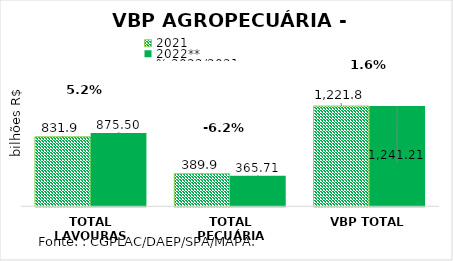
| Category | 2021 | 2022** |
|---|---|---|
| TOTAL LAVOURAS | 831.898 | 875.503 |
| TOTAL PECUÁRIA | 389.881 | 365.71 |
| VBP TOTAL | 1221.779 | 1241.213 |